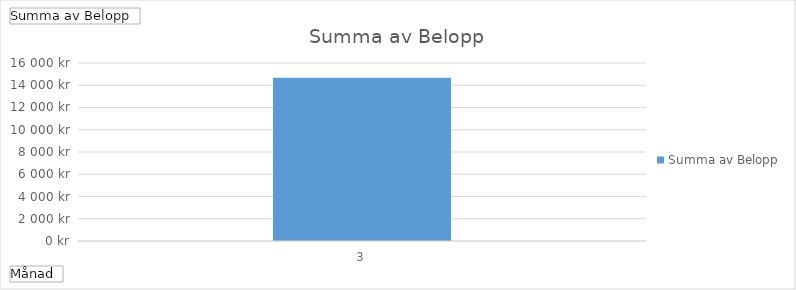
| Category | Summa |
|---|---|
| 3 | 14665.251 |